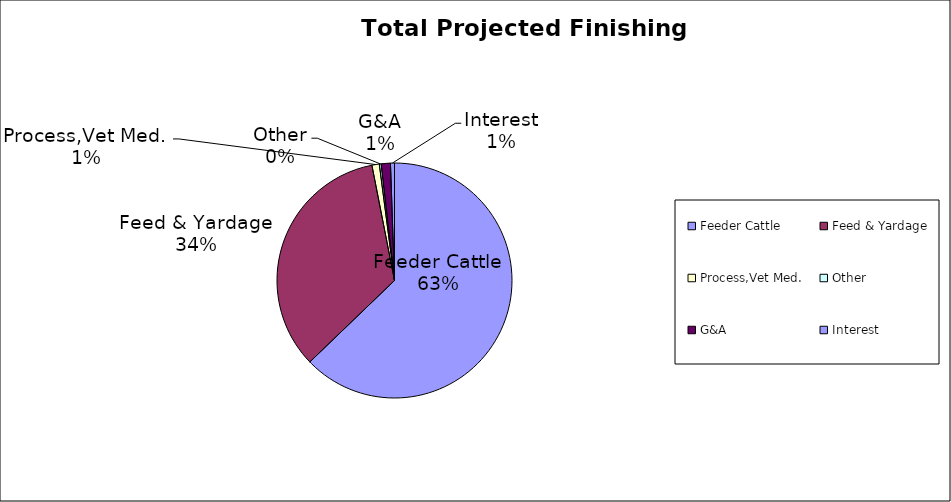
| Category | Total |
|---|---|
| Feeder Cattle | 124016.327 |
| Feed & Yardage | 67358.568 |
| Process,Vet Med. | 2000 |
| Other | 500 |
| G&A | 2500 |
| Interest | 1086.258 |